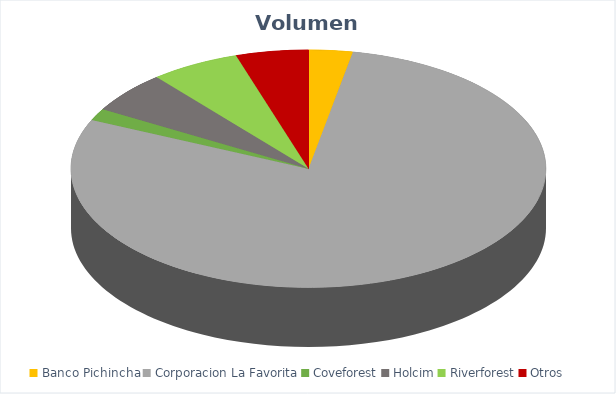
| Category | VOLUMEN ($USD) |
|---|---|
| Banco Pichincha | 3710 |
| Corporacion La Favorita | 97589.8 |
| Coveforest | 2002 |
| Holcim | 7000 |
| Riverforest | 7558.7 |
| Otros | 6108.15 |